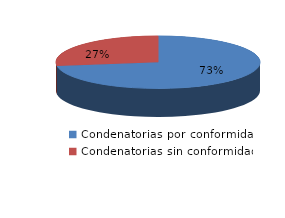
| Category | Series 0 |
|---|---|
| 0 | 48 |
| 1 | 18 |